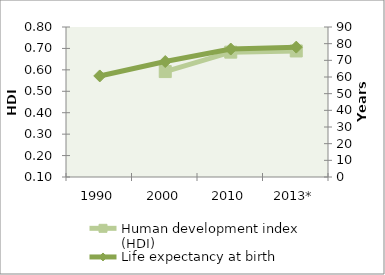
| Category | Human development index (HDI) |
|---|---|
| 1990 | 0 |
| 2000 | 0.592 |
| 2010 | 0.683 |
| 2013* | 0.688 |